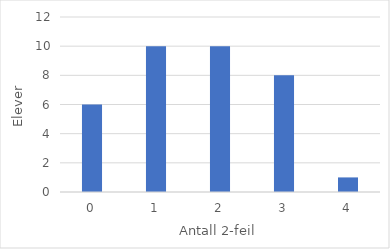
| Category | Series 0 |
|---|---|
| 0.0 | 6 |
| 1.0 | 10 |
| 2.0 | 10 |
| 3.0 | 8 |
| 4.0 | 1 |